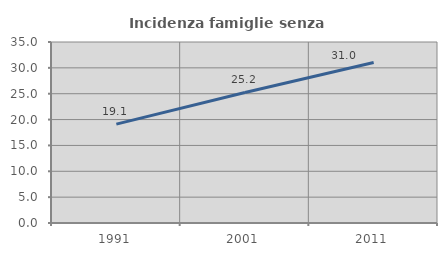
| Category | Incidenza famiglie senza nuclei |
|---|---|
| 1991.0 | 19.127 |
| 2001.0 | 25.238 |
| 2011.0 | 31.045 |